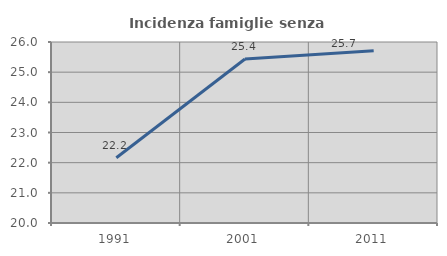
| Category | Incidenza famiglie senza nuclei |
|---|---|
| 1991.0 | 22.165 |
| 2001.0 | 25.434 |
| 2011.0 | 25.71 |